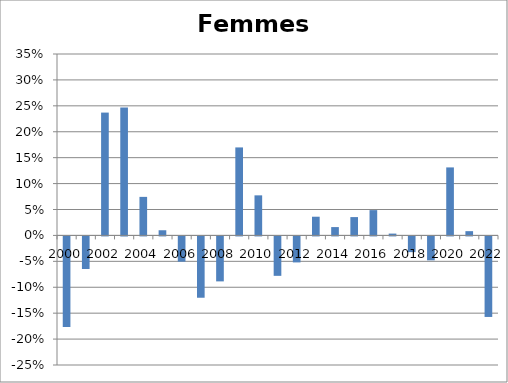
| Category | Femmes |
|---|---|
| 2000.0 | -0.175 |
| 2001.0 | -0.063 |
| 2002.0 | 0.237 |
| 2003.0 | 0.247 |
| 2004.0 | 0.074 |
| 2005.0 | 0.01 |
| 2006.0 | -0.049 |
| 2007.0 | -0.118 |
| 2008.0 | -0.087 |
| 2009.0 | 0.17 |
| 2010.0 | 0.077 |
| 2011.0 | -0.076 |
| 2012.0 | -0.05 |
| 2013.0 | 0.036 |
| 2014.0 | 0.016 |
| 2015.0 | 0.035 |
| 2016.0 | 0.049 |
| 2017.0 | 0.004 |
| 2018.0 | -0.03 |
| 2019.0 | -0.046 |
| 2020.0 | 0.131 |
| 2021.0 | 0.008 |
| 2022.0 | -0.155 |